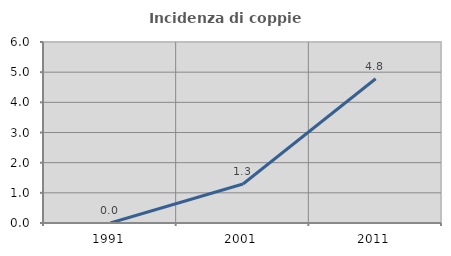
| Category | Incidenza di coppie miste |
|---|---|
| 1991.0 | 0 |
| 2001.0 | 1.293 |
| 2011.0 | 4.781 |